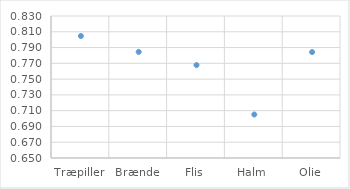
| Category | Series 0 |
|---|---|
| Træpiller | 0.805 |
| Brænde | 0.784 |
| Flis | 0.768 |
| Halm | 0.705 |
| Olie | 0.784 |